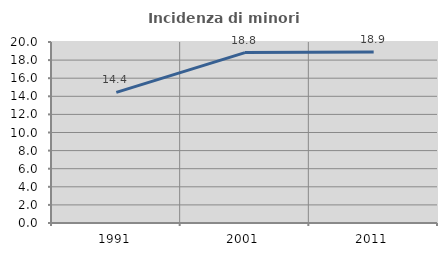
| Category | Incidenza di minori stranieri |
|---|---|
| 1991.0 | 14.433 |
| 2001.0 | 18.827 |
| 2011.0 | 18.888 |